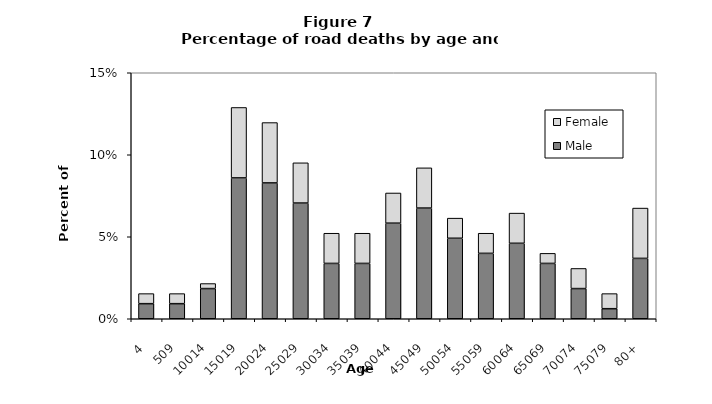
| Category | Male | Female |
|---|---|---|
| 4 | 0.009 | 0.006 |
| 509 | 0.009 | 0.006 |
| 10014 | 0.018 | 0.003 |
| 15019 | 0.086 | 0.043 |
| 20024 | 0.083 | 0.037 |
| 25029 | 0.071 | 0.025 |
| 30034 | 0.034 | 0.018 |
| 35039 | 0.034 | 0.018 |
| 40044 | 0.058 | 0.018 |
| 45049 | 0.067 | 0.025 |
| 50054 | 0.049 | 0.012 |
| 55059 | 0.04 | 0.012 |
| 60064 | 0.046 | 0.018 |
| 65069 | 0.034 | 0.006 |
| 70074 | 0.018 | 0.012 |
| 75079 | 0.006 | 0.009 |
| 80+ | 0.037 | 0.031 |